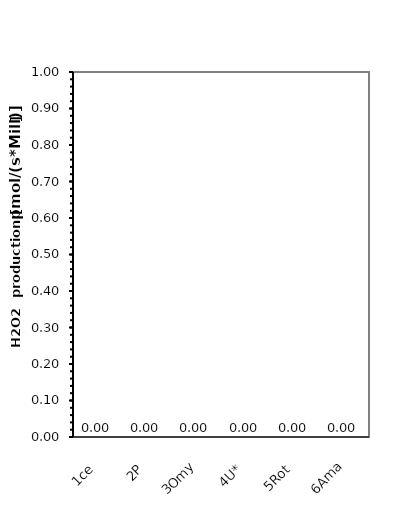
| Category | Amount per chamber (Mill cells/chamber) 2.000 |
|---|---|
| 1ce | 0 |
| 2P | 0 |
| 3Omy | 0 |
| 4U* | 0 |
| 5Rot | 0 |
| 6Ama | 0 |